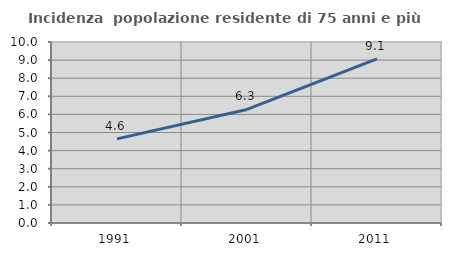
| Category | Incidenza  popolazione residente di 75 anni e più |
|---|---|
| 1991.0 | 4.649 |
| 2001.0 | 6.274 |
| 2011.0 | 9.066 |